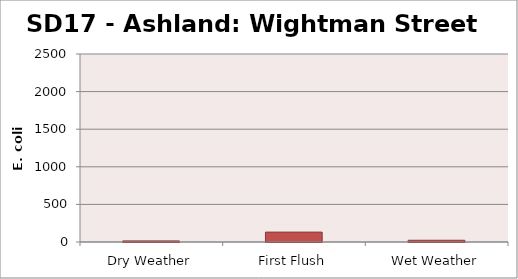
| Category | E. coli MPN |
|---|---|
| Dry Weather | 14.8 |
| First Flush | 131.7 |
| Wet Weather | 23.1 |